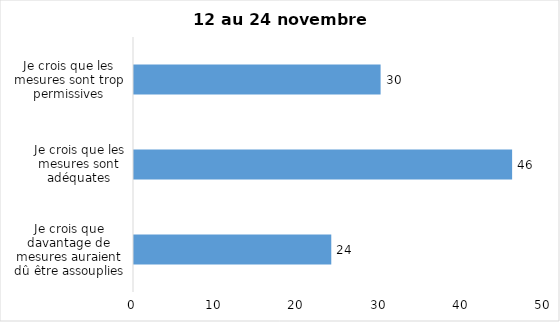
| Category | Series 0 |
|---|---|
| Je crois que davantage de mesures auraient dû être assouplies | 24 |
| Je crois que les mesures sont adéquates | 46 |
| Je crois que les mesures sont trop permissives | 30 |